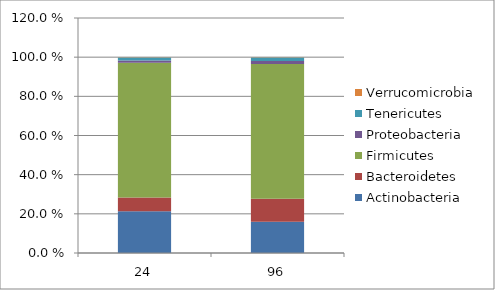
| Category | Actinobacteria | Bacteroidetes | Firmicutes | Proteobacteria | Tenericutes | Verrucomicrobia |
|---|---|---|---|---|---|---|
| 24.0 | 0.213 | 0.071 | 0.688 | 0.011 | 0.015 | 0.002 |
| 96.0 | 0.16 | 0.117 | 0.689 | 0.015 | 0.018 | 0.002 |